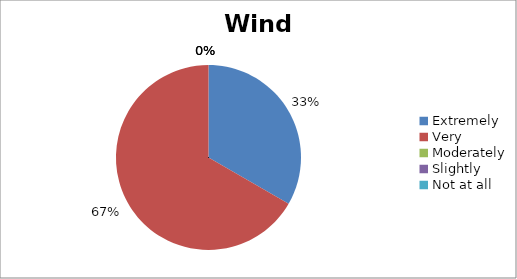
| Category | Wind |
|---|---|
| Extremely | 1 |
| Very | 2 |
| Moderately | 0 |
| Slightly | 0 |
| Not at all | 0 |